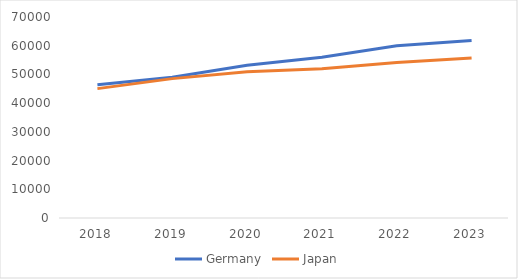
| Category | Germany | Japan |
|---|---|---|
| 2018.0 | 46420 | 45060 |
| 2019.0 | 49010 | 48540 |
| 2020.0 | 53210 | 50970 |
| 2021.0 | 56020 | 51970 |
| 2022.0 | 60010 | 54120 |
| 2023.0 | 61810.3 | 55743.6 |